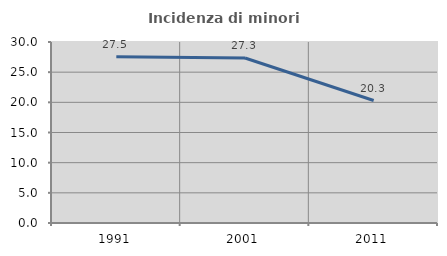
| Category | Incidenza di minori stranieri |
|---|---|
| 1991.0 | 27.546 |
| 2001.0 | 27.344 |
| 2011.0 | 20.299 |